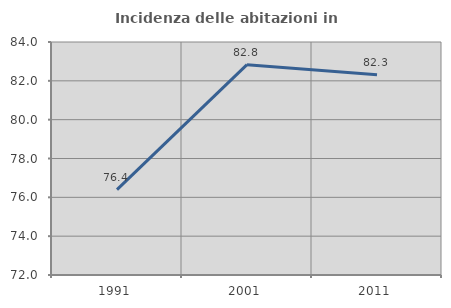
| Category | Incidenza delle abitazioni in proprietà  |
|---|---|
| 1991.0 | 76.401 |
| 2001.0 | 82.834 |
| 2011.0 | 82.313 |